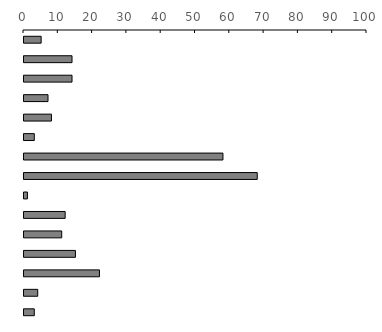
| Category | Series 0 |
|---|---|
| 0 | 5 |
| 1 | 14 |
| 2 | 14 |
| 3 | 7 |
| 4 | 8 |
| 5 | 3 |
| 6 | 58 |
| 7 | 68 |
| 8 | 1 |
| 9 | 12 |
| 10 | 11 |
| 11 | 15 |
| 12 | 22 |
| 13 | 4 |
| 14 | 3 |